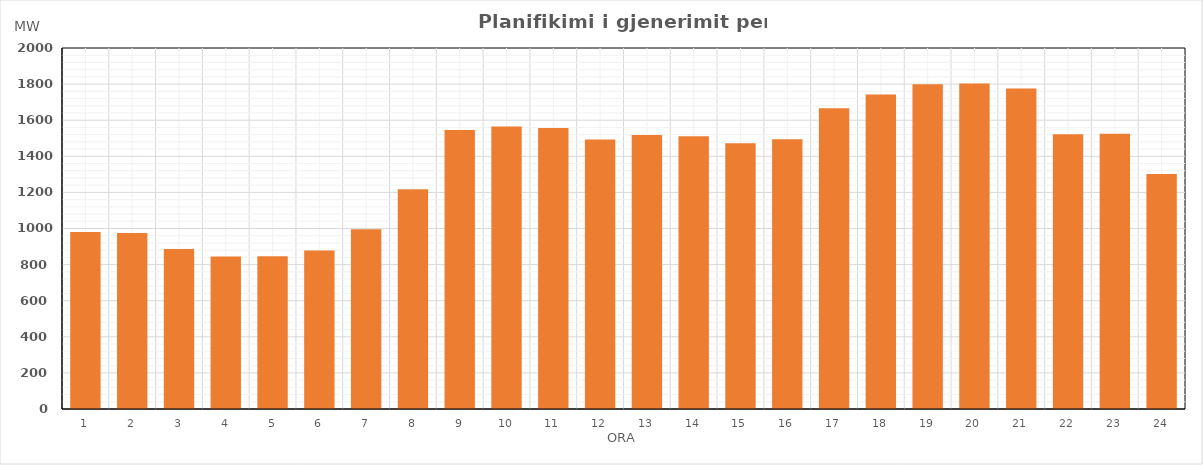
| Category | Max (MW) |
|---|---|
| 0 | 980.819 |
| 1 | 975.205 |
| 2 | 886.43 |
| 3 | 845.495 |
| 4 | 846.446 |
| 5 | 877.435 |
| 6 | 995.765 |
| 7 | 1217.75 |
| 8 | 1545.34 |
| 9 | 1564.61 |
| 10 | 1557.062 |
| 11 | 1492.489 |
| 12 | 1518.505 |
| 13 | 1511.54 |
| 14 | 1472.84 |
| 15 | 1493.951 |
| 16 | 1666.693 |
| 17 | 1741.863 |
| 18 | 1798.587 |
| 19 | 1802.877 |
| 20 | 1776.093 |
| 21 | 1522.13 |
| 22 | 1524.421 |
| 23 | 1302.347 |